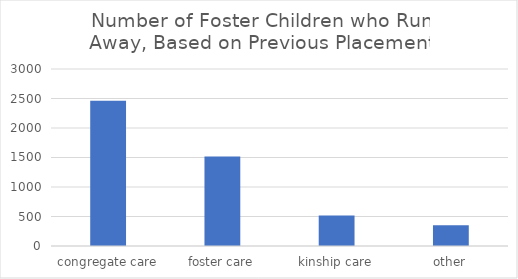
| Category | freq |
|---|---|
| congregate care | 2463 |
| foster care | 1519 |
| kinship care | 518 |
| other | 351 |